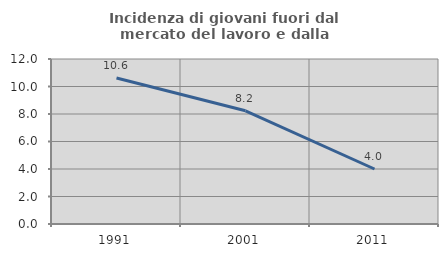
| Category | Incidenza di giovani fuori dal mercato del lavoro e dalla formazione  |
|---|---|
| 1991.0 | 10.619 |
| 2001.0 | 8.235 |
| 2011.0 | 4 |